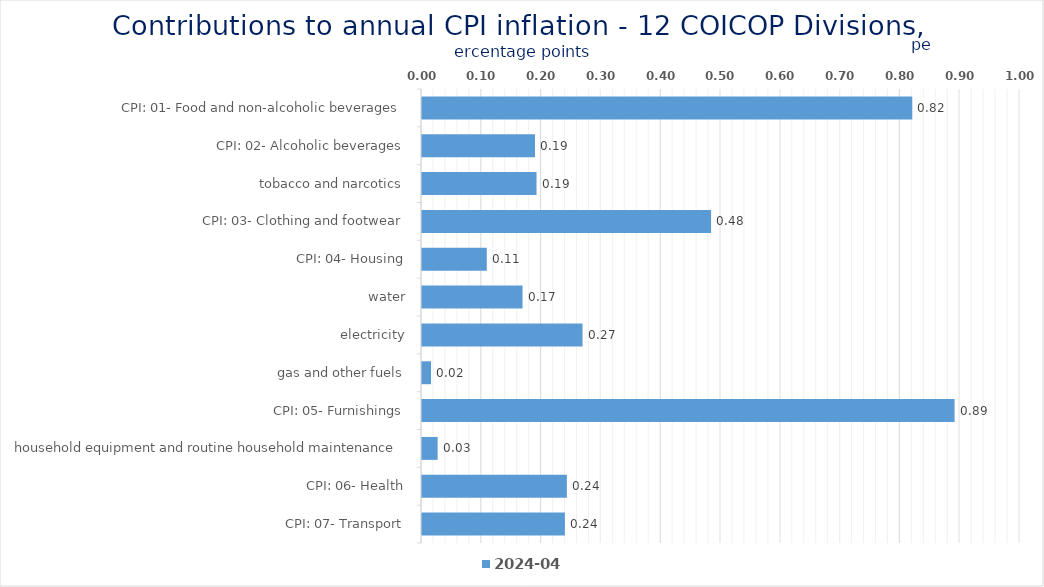
| Category | 2024-04 |
|---|---|
| CPI: 01- Food and non-alcoholic beverages | 0.82 |
| CPI: 02- Alcoholic beverages, tobacco and narcotics | 0.189 |
| CPI: 03- Clothing and footwear | 0.192 |
| CPI: 04- Housing, water, electricity, gas and other fuels | 0.483 |
| CPI: 05- Furnishings, household equipment and routine household maintenance | 0.108 |
| CPI: 06- Health | 0.168 |
| CPI: 07- Transport | 0.268 |
| CPI: 08- Communication | 0.015 |
| CPI: 09- Recreation and culture | 0.891 |
| CPI: 10- Education | 0.026 |
| CPI: 11- Restaurants and hotels | 0.242 |
| CPI: 12- Miscellaneous goods and services | 0.239 |